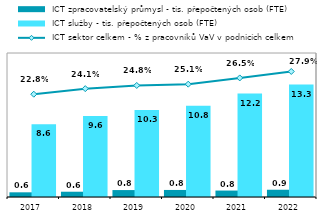
| Category |  ICT zpracovatelský průmysl - tis. přepočtených osob (FTE) |  ICT služby - tis. přepočtených osob (FTE) |
|---|---|---|
| 2017.0 | 0.553 | 8.578 |
| 2018.0 | 0.623 | 9.573 |
| 2019.0 | 0.818 | 10.284 |
| 2020.0 | 0.832 | 10.76 |
| 2021.0 | 0.761 | 12.21 |
| 2022.0 | 0.857 | 13.276 |